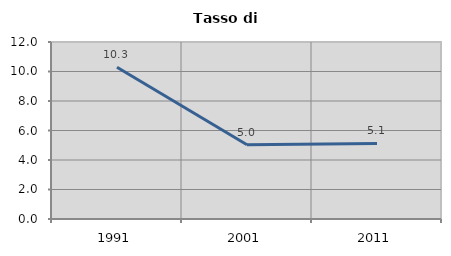
| Category | Tasso di disoccupazione   |
|---|---|
| 1991.0 | 10.284 |
| 2001.0 | 5.038 |
| 2011.0 | 5.126 |